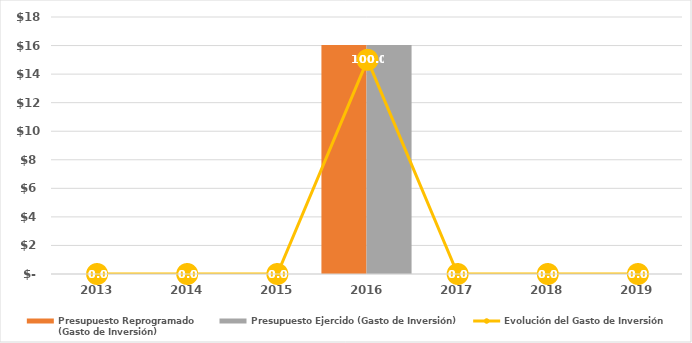
| Category | Presupuesto Reprogramado
(Gasto de Inversión) | Presupuesto Ejercido (Gasto de Inversión) |
|---|---|---|
| 2013.0 | 0 | 0 |
| 2014.0 | 0 | 0 |
| 2015.0 | 0 | 0 |
| 2016.0 | 16031.3 | 16031.3 |
| 2017.0 | 0 | 0 |
| 2018.0 | 0 | 0 |
| 2019.0 | 0 | 0 |